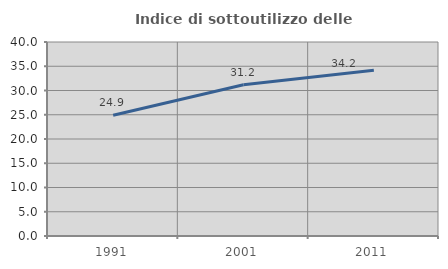
| Category | Indice di sottoutilizzo delle abitazioni  |
|---|---|
| 1991.0 | 24.88 |
| 2001.0 | 31.188 |
| 2011.0 | 34.196 |